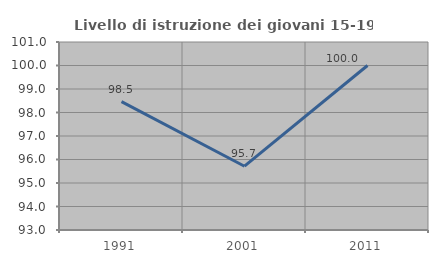
| Category | Livello di istruzione dei giovani 15-19 anni |
|---|---|
| 1991.0 | 98.462 |
| 2001.0 | 95.714 |
| 2011.0 | 100 |